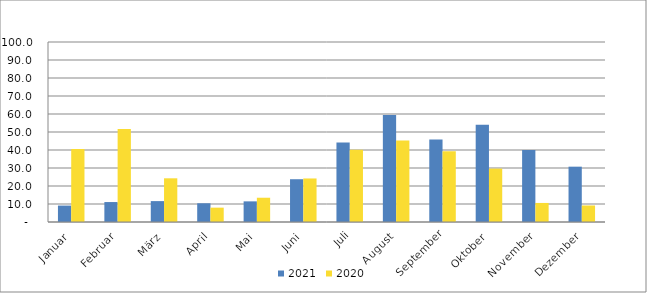
| Category | 2021 | 2020 |
|---|---|---|
| Januar | 9.118 | 40.49 |
| Februar | 11.086 | 51.681 |
| März | 11.607 | 24.273 |
| April | 10.404 | 7.97 |
| Mai | 11.464 | 13.481 |
| Juni | 23.763 | 24.186 |
| Juli | 44.195 | 40.177 |
| August | 59.389 | 45.226 |
| September | 45.776 | 39.287 |
| Oktober | 54.001 | 29.665 |
| November | 39.954 | 10.583 |
| Dezember | 30.738 | 9.181 |